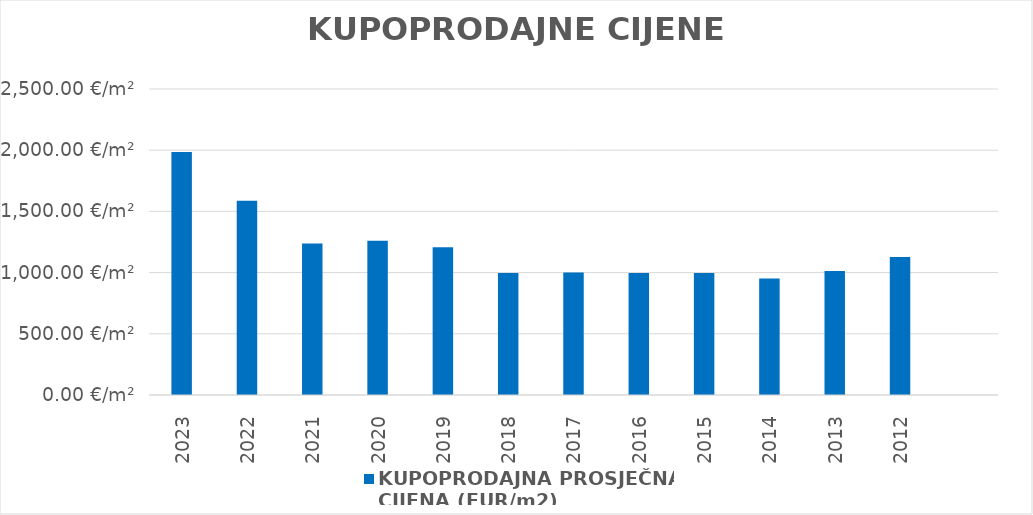
| Category | KUPOPRODAJNA PROSJEČNA 
CIJENA (EUR/m2) |
|---|---|
| 2023 | 1905-06-08 03:29:58 |
| 2022 | 1904-05-04 01:30:43 |
| 2021 | 1903-05-22 08:30:41 |
| 2020 | 1903-06-13 00:37:46 |
| 2019 | 1903-04-20 05:58:53 |
| 2018 | 1902-09-21 18:06:00 |
| 2017 | 1902-09-27 17:11:19 |
| 2016 | 1902-09-23 02:45:01 |
| 2015 | 1902-09-21 18:12:03 |
| 2014 | 1902-08-09 13:23:04 |
| 2013 | 1902-10-08 15:05:42 |
| 2012 | 1903-01-30 20:12:39 |